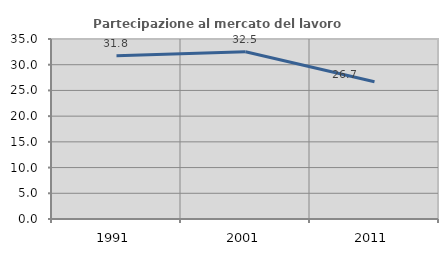
| Category | Partecipazione al mercato del lavoro  femminile |
|---|---|
| 1991.0 | 31.766 |
| 2001.0 | 32.537 |
| 2011.0 | 26.676 |